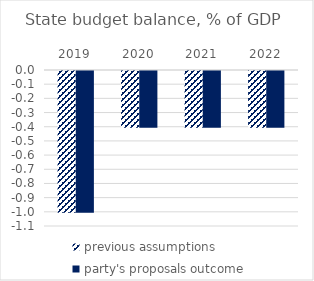
| Category | previous assumptions | party's proposals outcome |
|---|---|---|
| 2019.0 | -1 | -1 |
| 2020.0 | -0.4 | -0.4 |
| 2021.0 | -0.4 | -0.4 |
| 2022.0 | -0.4 | -0.4 |